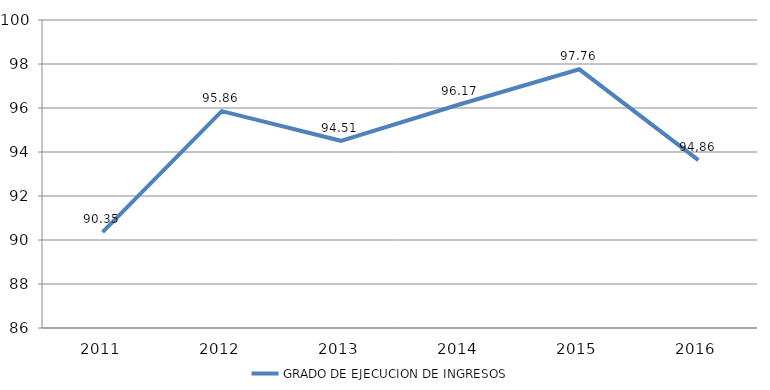
| Category | GRADO DE EJECUCION DE INGRESOS |
|---|---|
| 2011.0 | 90.354 |
| 2012.0 | 95.858 |
| 2013.0 | 94.509 |
| 2014.0 | 96.171 |
| 2015.0 | 97.758 |
| 2016.0 | 93.63 |